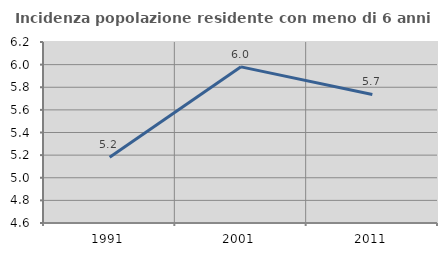
| Category | Incidenza popolazione residente con meno di 6 anni |
|---|---|
| 1991.0 | 5.181 |
| 2001.0 | 5.98 |
| 2011.0 | 5.736 |